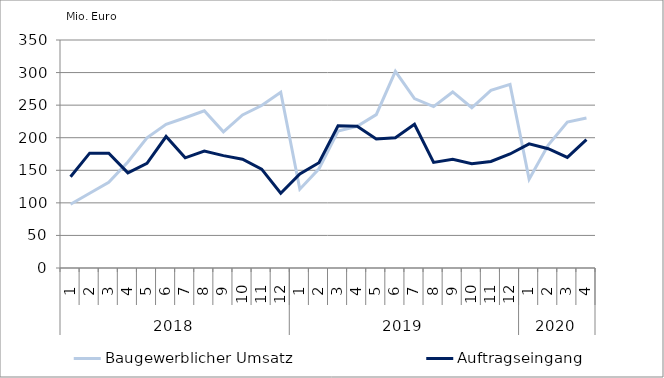
| Category | Baugewerblicher Umsatz | Auftragseingang |
|---|---|---|
| 0 | 97959.056 | 140119.385 |
| 1 | 114756.787 | 176330.213 |
| 2 | 131454.642 | 176241.061 |
| 3 | 162648.053 | 146063.407 |
| 4 | 199809.407 | 160551.931 |
| 5 | 220535.974 | 201835.846 |
| 6 | 230672.472 | 169132.23 |
| 7 | 241233.619 | 179396.293 |
| 8 | 209099.292 | 172542.764 |
| 9 | 234953.007 | 166991.729 |
| 10 | 249410.043 | 151835.629 |
| 11 | 269773.227 | 114807.456 |
| 12 | 120975.133 | 144510.881 |
| 13 | 152329.786 | 161685.201 |
| 14 | 210227.67 | 218455.879 |
| 15 | 217522.321 | 217610.064 |
| 16 | 235490.429 | 198110.439 |
| 17 | 301963.302 | 200012.086 |
| 18 | 259975.317 | 220559.061 |
| 19 | 247779.658 | 162059.723 |
| 20 | 270249.609 | 166829.611 |
| 21 | 245966.91 | 160120.773 |
| 22 | 272620.351 | 163589.389 |
| 23 | 281810.121 | 175051.247 |
| 24 | 136135.432 | 190647.086 |
| 25 | 188682.361 | 183141.14 |
| 26 | 224009.315 | 169770.009 |
| 27 | 230172.252 | 196979.845 |